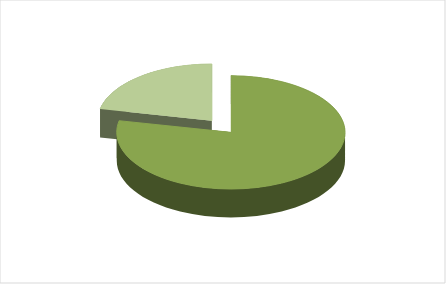
| Category | Series 0 |
|---|---|
| 0 | 0.783 |
| 1 | 0.217 |